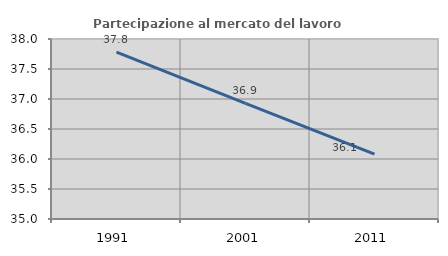
| Category | Partecipazione al mercato del lavoro  femminile |
|---|---|
| 1991.0 | 37.781 |
| 2001.0 | 36.927 |
| 2011.0 | 36.081 |